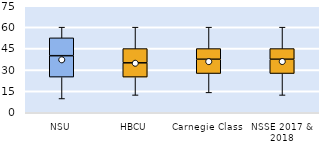
| Category | 25th | 50th | 75th |
|---|---|---|---|
| NSU | 25 | 15 | 12.5 |
| HBCU | 25 | 10 | 10 |
| Carnegie Class | 27.5 | 10 | 7.5 |
| NSSE 2017 & 2018 | 27.5 | 10 | 7.5 |